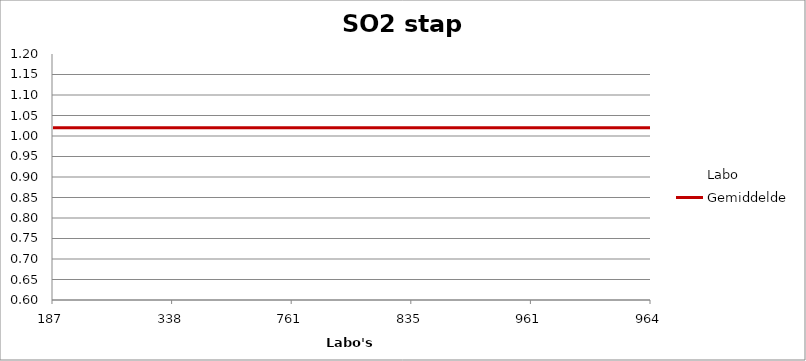
| Category | Labo | Gemiddelde |
|---|---|---|
| 187.0 | 0.981 | 1.02 |
| 338.0 | 0.831 | 1.02 |
| 761.0 | 1.04 | 1.02 |
| 835.0 | 1.447 | 1.02 |
| 961.0 | 1.046 | 1.02 |
| 964.0 | 0.963 | 1.02 |